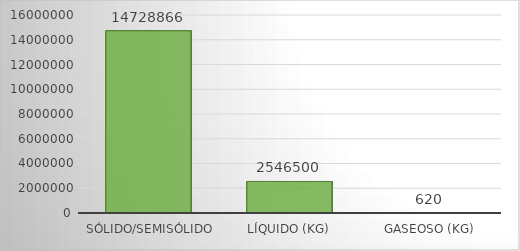
| Category | Series 0 |
|---|---|
| Sólido/Semisólido (kg) | 14728866.04 |
| Líquido (kg) | 2546499.71 |
| Gaseoso (kg) | 620.09 |